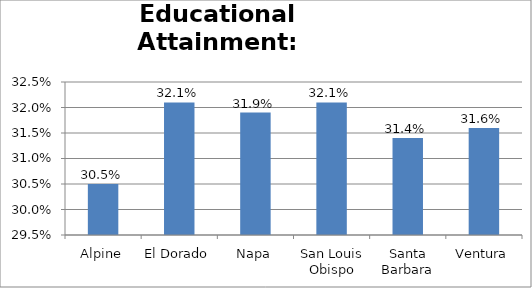
| Category | Series 0 |
|---|---|
| Alpine | 0.305 |
| El Dorado | 0.321 |
| Napa | 0.319 |
| San Louis Obispo | 0.321 |
| Santa Barbara | 0.314 |
| Ventura | 0.316 |